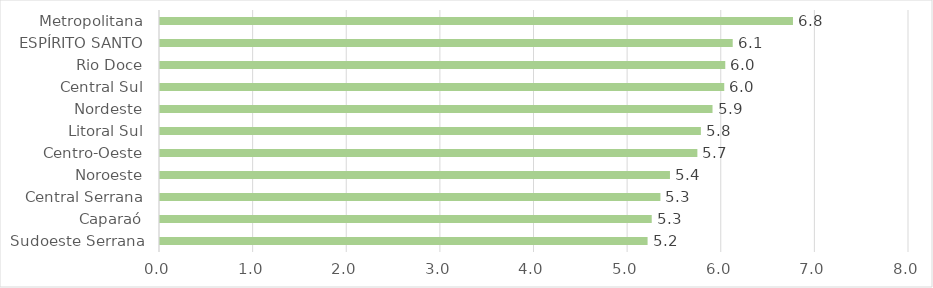
| Category | Series 0 |
|---|---|
| Sudoeste Serrana | 5.208 |
| Caparaó | 5.252 |
| Central Serrana | 5.345 |
| Noroeste | 5.447 |
| Centro-Oeste | 5.74 |
| Litoral Sul | 5.777 |
| Nordeste | 5.901 |
| Central Sul | 6.027 |
| Rio Doce | 6.038 |
| ESPÍRITO SANTO | 6.117 |
| Metropolitana | 6.761 |